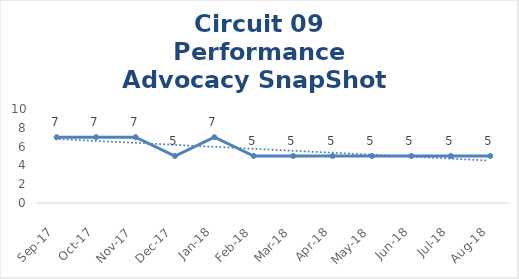
| Category | Circuit 09 |
|---|---|
| Sep-17 | 7 |
| Oct-17 | 7 |
| Nov-17 | 7 |
| Dec-17 | 5 |
| Jan-18 | 7 |
| Feb-18 | 5 |
| Mar-18 | 5 |
| Apr-18 | 5 |
| May-18 | 5 |
| Jun-18 | 5 |
| Jul-18 | 5 |
| Aug-18 | 5 |